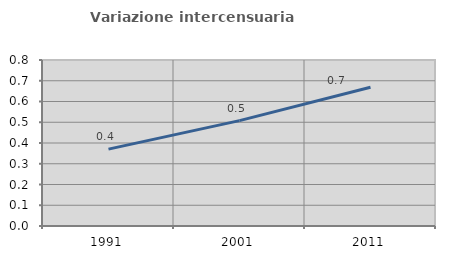
| Category | Variazione intercensuaria annua |
|---|---|
| 1991.0 | 0.37 |
| 2001.0 | 0.508 |
| 2011.0 | 0.669 |